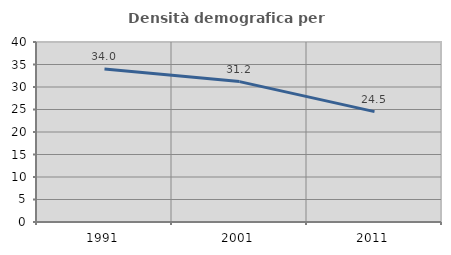
| Category | Densità demografica |
|---|---|
| 1991.0 | 34.001 |
| 2001.0 | 31.201 |
| 2011.0 | 24.534 |